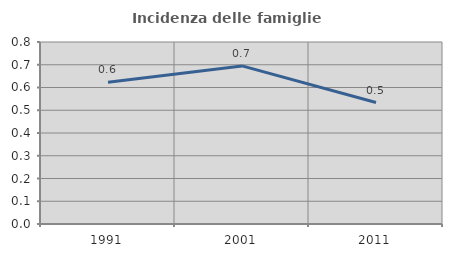
| Category | Incidenza delle famiglie numerose |
|---|---|
| 1991.0 | 0.624 |
| 2001.0 | 0.695 |
| 2011.0 | 0.534 |